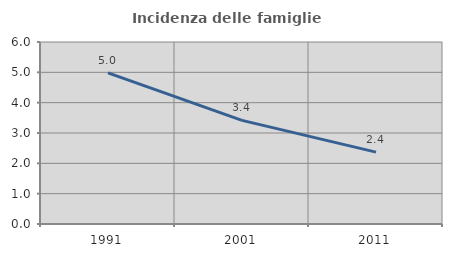
| Category | Incidenza delle famiglie numerose |
|---|---|
| 1991.0 | 4.983 |
| 2001.0 | 3.416 |
| 2011.0 | 2.368 |